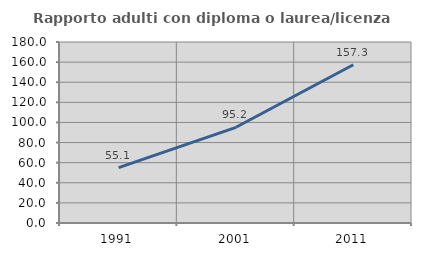
| Category | Rapporto adulti con diploma o laurea/licenza media  |
|---|---|
| 1991.0 | 55.072 |
| 2001.0 | 95.172 |
| 2011.0 | 157.343 |